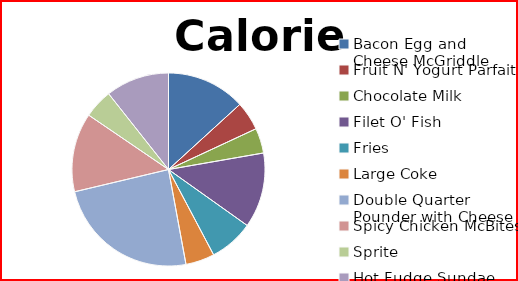
| Category | Calories |
|---|---|
| Bacon Egg and Cheese McGriddle | 410 |
| Fruit N' Yogurt Parfait | 150 |
| Chocolate Milk | 130 |
| Filet O' Fish | 390 |
| Fries | 230 |
| Large Coke | 150 |
| Double Quarter Pounder with Cheese | 750 |
| Spicy Chicken McBites | 410 |
| Sprite | 150 |
| Hot Fudge Sundae | 330 |